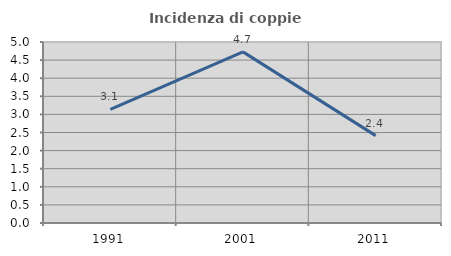
| Category | Incidenza di coppie miste |
|---|---|
| 1991.0 | 3.139 |
| 2001.0 | 4.727 |
| 2011.0 | 2.414 |